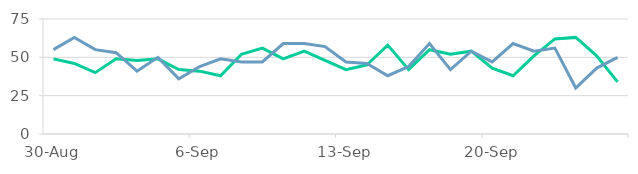
| Category | SNS | ABN |
|---|---|---|
| 2015-08-30 | 49 | 55 |
| 2015-08-31 | 46 | 63 |
| 2015-09-01 | 40 | 55 |
| 2015-09-02 | 49 | 53 |
| 2015-09-03 | 48 | 41 |
| 2015-09-04 | 49 | 50 |
| 2015-09-05 | 42 | 36 |
| 2015-09-06 | 41 | 44 |
| 2015-09-07 | 38 | 49 |
| 2015-09-08 | 52 | 47 |
| 2015-09-09 | 56 | 47 |
| 2015-09-10 | 49 | 59 |
| 2015-09-11 | 54 | 59 |
| 2015-09-12 | 48 | 57 |
| 2015-09-13 | 42 | 47 |
| 2015-09-14 | 45 | 46 |
| 2015-09-15 | 58 | 38 |
| 2015-09-16 | 42 | 44 |
| 2015-09-17 | 55 | 59 |
| 2015-09-18 | 52 | 42 |
| 2015-09-19 | 54 | 54 |
| 2015-09-20 | 43 | 47 |
| 2015-09-21 | 38 | 59 |
| 2015-09-22 | 51 | 54 |
| 2015-09-23 | 62 | 56 |
| 2015-09-24 | 63 | 30 |
| 2015-09-25 | 51 | 43 |
| 2015-09-26 | 34 | 50 |